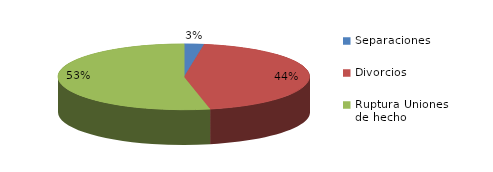
| Category | Series 0 |
|---|---|
| Separaciones | 19 |
| Divorcios | 333 |
| Ruptura Uniones de hecho | 402 |